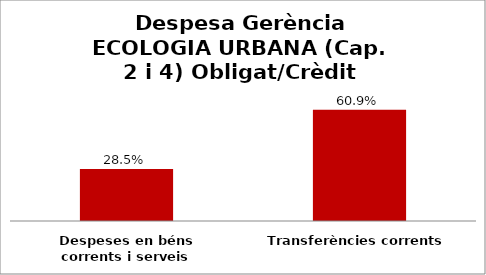
| Category | Series 0 |
|---|---|
| Despeses en béns corrents i serveis | 0.285 |
| Transferències corrents | 0.609 |